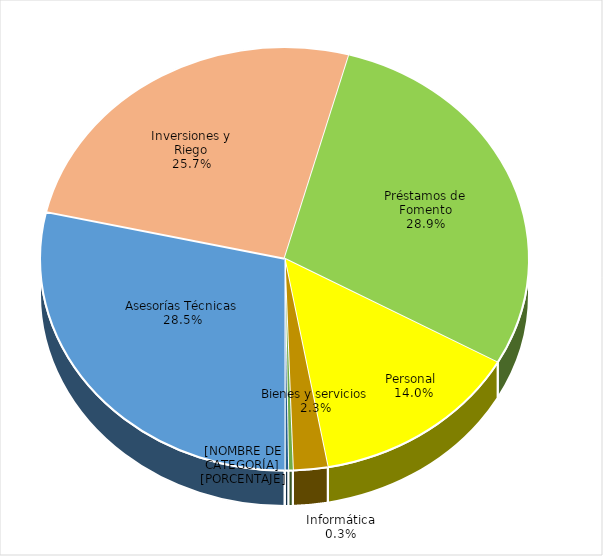
| Category | Series 0 |
|---|---|
| Asesorías Técnicas | 86963176 |
| Inversiones y Riego | 78399568 |
| Préstamos de Fomento | 88003274 |
| Personal  | 42708109 |
| Bienes y servicios | 6964268 |
| Informática | 934313 |
| Vehículos, Mobiliario y Equipos 
 | 726894 |
| Otros | 30 |